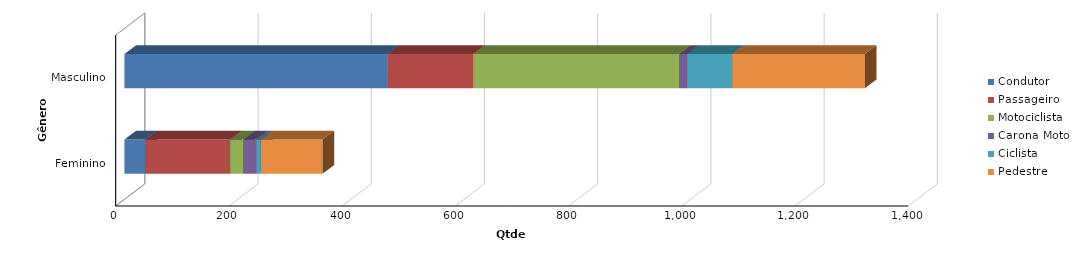
| Category | Condutor | Passageiro | Motociclista | Carona Moto | Ciclista | Pedestre |
|---|---|---|---|---|---|---|
| Feminino | 37 | 150 | 23 | 23 | 8 | 109 |
| Masculino | 465 | 151 | 364 | 14 | 80 | 234 |